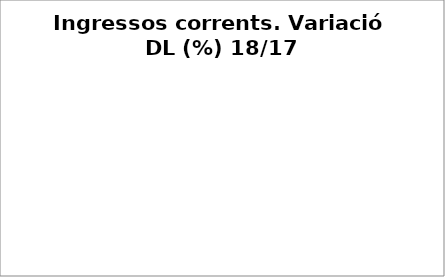
| Category | Series 0 |
|---|---|
| Impostos locals | -0.057 |
| Participació Tributs de l'Estat | 0.057 |
| Taxes i altres ingressos | 0.032 |
| Transferències corrents (exc. FCF) | 0.445 |
| Ingressos patrimonials | -0.18 |
| Ingressos corrents | -0.018 |